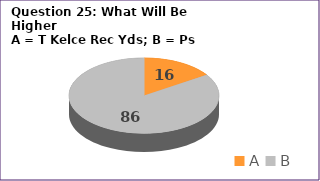
| Category | Series 0 |
|---|---|
| A | 16 |
| B | 86 |